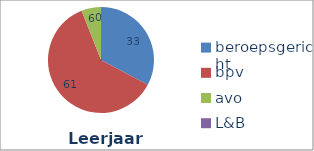
| Category | Series 0 |
|---|---|
| beroepsgericht | 32.766 |
| bpv | 61.277 |
| avo | 5.957 |
| L&B | 0 |